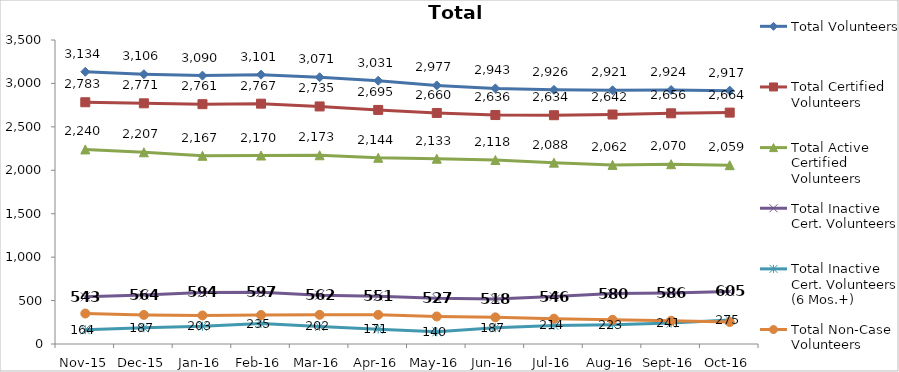
| Category | Total Volunteers | Total Certified Volunteers | Total Active Certified Volunteers | Total Inactive Cert. Volunteers | Total Inactive Cert. Volunteers (6 Mos.+) | Total Non-Case Volunteers |
|---|---|---|---|---|---|---|
| Nov-15 | 3134 | 2783 | 2240 | 543 | 164 | 351 |
| Dec-15 | 3106 | 2771 | 2207 | 564 | 187 | 335 |
| Jan-16 | 3090 | 2761 | 2167 | 594 | 203 | 329 |
| Feb-16 | 3101 | 2767 | 2170 | 597 | 235 | 334 |
| Mar-16 | 3071 | 2735 | 2173 | 562 | 202 | 336 |
| Apr-16 | 3031 | 2695 | 2144 | 551 | 171 | 336 |
| May-16 | 2977 | 2660 | 2133 | 527 | 140 | 317 |
| Jun-16 | 2943 | 2636 | 2118 | 518 | 187 | 307 |
| Jul-16 | 2926 | 2634 | 2088 | 546 | 214 | 292 |
| Aug-16 | 2921 | 2642 | 2062 | 580 | 223 | 279 |
| Sep-16 | 2924 | 2656 | 2070 | 586 | 241 | 268 |
| Oct-16 | 2917 | 2664 | 2059 | 605 | 275 | 253 |